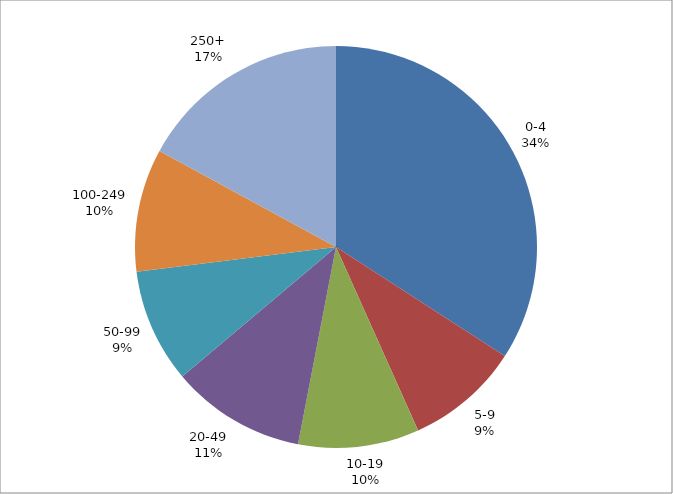
| Category | Series 0 |
|---|---|
| 0-4 | 186 |
| 5-9 | 50 |
| 10-19 | 53 |
| 20-49 | 59 |
| 50-99 | 50 |
| 100-249 | 54 |
| 250+ | 93 |